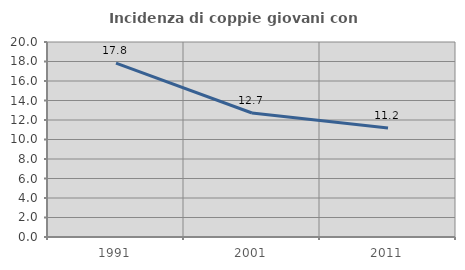
| Category | Incidenza di coppie giovani con figli |
|---|---|
| 1991.0 | 17.839 |
| 2001.0 | 12.716 |
| 2011.0 | 11.176 |